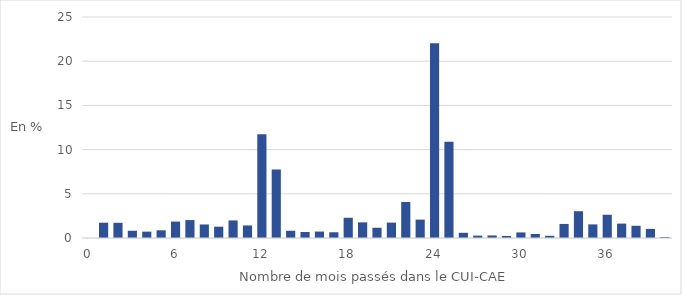
| Category | Effectif (en %) |
|---|---|
| 0.0 | 0 |
| 1.0 | 1.73 |
| 2.0 | 1.72 |
| 3.0 | 0.82 |
| 4.0 | 0.72 |
| 5.0 | 0.87 |
| 6.0 | 1.86 |
| 7.0 | 2.03 |
| 8.0 | 1.53 |
| 9.0 | 1.28 |
| 10.0 | 1.99 |
| 11.0 | 1.42 |
| 12.0 | 11.75 |
| 13.0 | 7.75 |
| 14.0 | 0.82 |
| 15.0 | 0.68 |
| 16.0 | 0.73 |
| 17.0 | 0.65 |
| 18.0 | 2.29 |
| 19.0 | 1.77 |
| 20.0 | 1.16 |
| 21.0 | 1.74 |
| 22.0 | 4.07 |
| 23.0 | 2.08 |
| 24.0 | 22.04 |
| 25.0 | 10.88 |
| 26.0 | 0.59 |
| 27.0 | 0.27 |
| 28.0 | 0.29 |
| 29.0 | 0.23 |
| 30.0 | 0.63 |
| 31.0 | 0.45 |
| 32.0 | 0.25 |
| 33.0 | 1.59 |
| 34.0 | 3.03 |
| 35.0 | 1.54 |
| 36.0 | 2.63 |
| 37.0 | 1.63 |
| 38.0 | 1.38 |
| 39.0 | 1.03 |
| 40.0 | 0.11 |